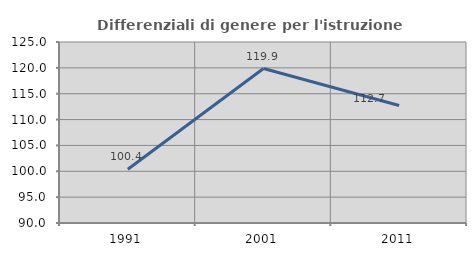
| Category | Differenziali di genere per l'istruzione superiore |
|---|---|
| 1991.0 | 100.38 |
| 2001.0 | 119.873 |
| 2011.0 | 112.711 |